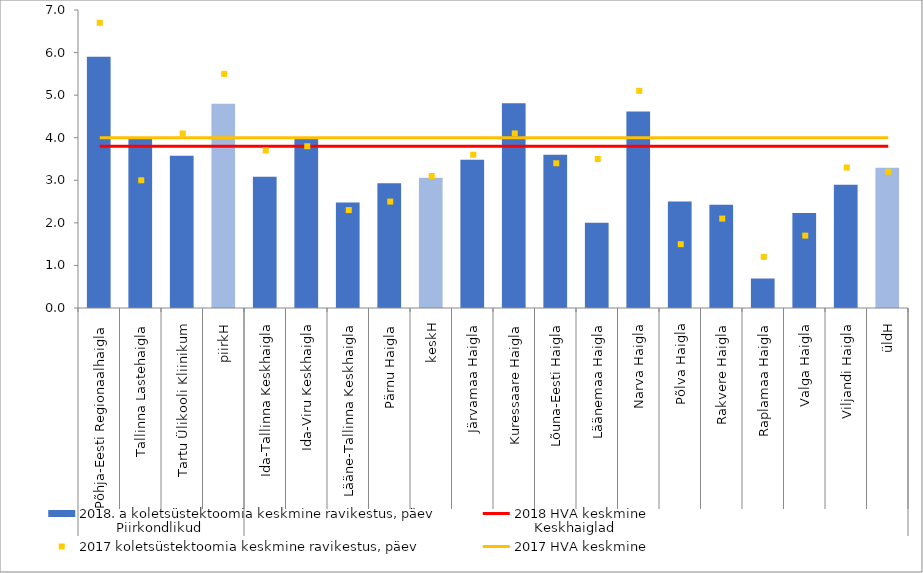
| Category | 2018. a koletsüstektoomia keskmine ravikestus, päev |
|---|---|
| 0 | 5.9 |
| 1 | 4 |
| 2 | 3.578 |
| 3 | 4.8 |
| 4 | 3.082 |
| 5 | 4.006 |
| 6 | 2.479 |
| 7 | 2.931 |
| 8 | 3.06 |
| 9 | 3.483 |
| 10 | 4.812 |
| 11 | 3.602 |
| 12 | 2 |
| 13 | 4.614 |
| 14 | 2.5 |
| 15 | 2.427 |
| 16 | 0.692 |
| 17 | 2.234 |
| 18 | 2.893 |
| 19 | 3.292 |